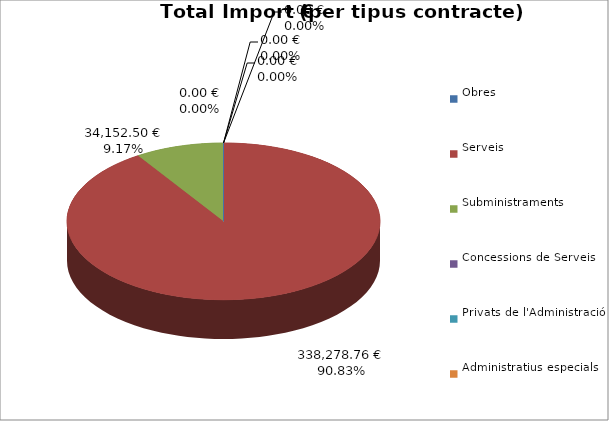
| Category | Total preu
(amb IVA) |
|---|---|
| Obres | 0 |
| Serveis | 338278.76 |
| Subministraments | 34152.5 |
| Concessions de Serveis | 0 |
| Privats de l'Administració | 0 |
| Administratius especials | 0 |